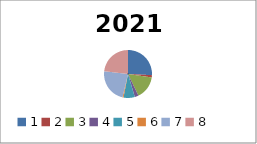
| Category | Series 0 |
|---|---|
| 1.0 | 681223.69 |
| 2.0 | 40000 |
| 3.0 | 411000 |
| 4.0 | 68253.88 |
| 5.0 | 200123.28 |
| 6.0 | 18259.27 |
| 7.0 | 611801.42 |
| 8.0 | 611801.42 |